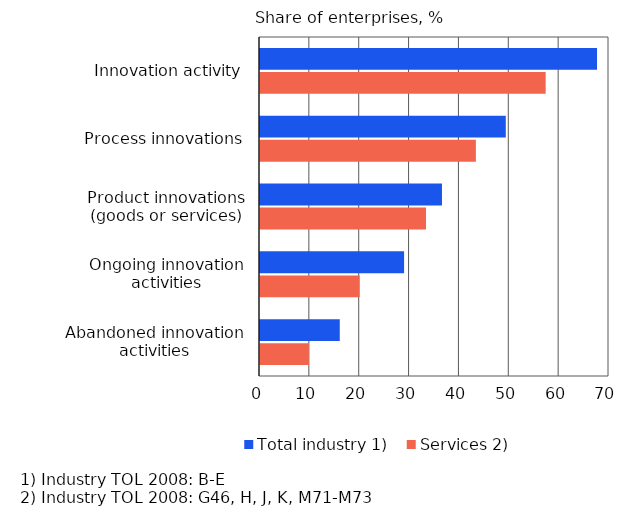
| Category | Total industry 1) | Services 2) |
|---|---|---|
| Innovation activity | 67.6 | 57.3 |
| Process innovations | 49.3 | 43.3 |
| Product innovations (goods or services) | 36.5 | 33.3 |
| Ongoing innovation activities | 28.9 | 20 |
| Abandoned innovation activities | 16 | 9.8 |